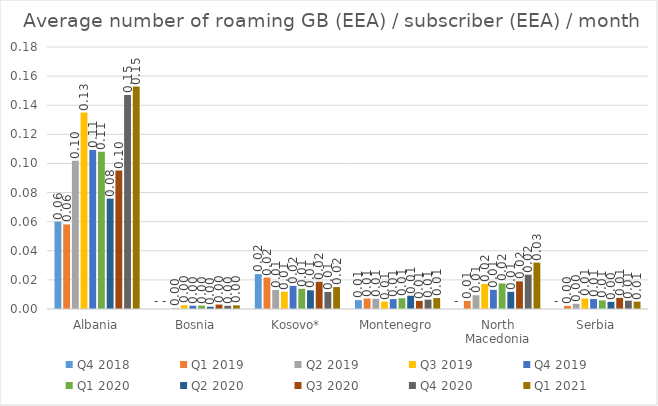
| Category | Q4 2018 | Q1 2019 | Q2 2019 | Q3 2019 | Q4 2019 | Q1 2020 | Q2 2020 | Q3 2020 | Q4 2020 | Q1 2021 |
|---|---|---|---|---|---|---|---|---|---|---|
| Albania | 0.06 | 0.058 | 0.102 | 0.135 | 0.109 | 0.108 | 0.076 | 0.095 | 0.147 | 0.153 |
| Bosnia | 0 | 0 | 0.001 | 0.003 | 0.002 | 0.002 | 0.002 | 0.003 | 0.002 | 0.003 |
| Kosovo* | 0.024 | 0.022 | 0.013 | 0.012 | 0.016 | 0.014 | 0.013 | 0.019 | 0.012 | 0.015 |
| Montenegro | 0.006 | 0.007 | 0.007 | 0.005 | 0.007 | 0.007 | 0.009 | 0.006 | 0.006 | 0.008 |
| North Macedonia | 0 | 0.006 | 0.009 | 0.017 | 0.013 | 0.018 | 0.012 | 0.019 | 0.024 | 0.032 |
| Serbia | 0 | 0.002 | 0.004 | 0.007 | 0.007 | 0.006 | 0.005 | 0.008 | 0.006 | 0.005 |